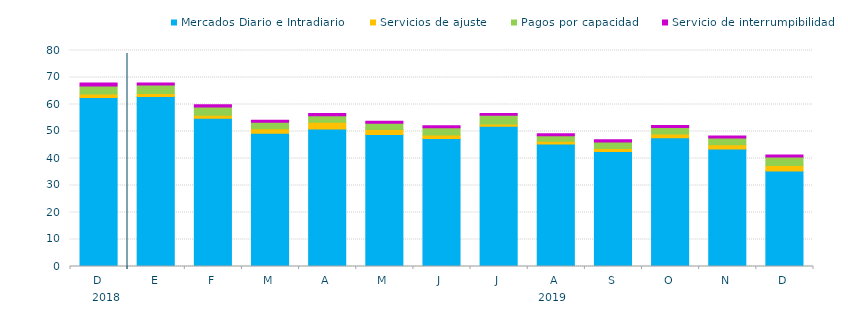
| Category | Mercados Diario e Intradiario  | Servicios de ajuste | Pagos por capacidad | Servicio de interrumpibilidad |
|---|---|---|---|---|
| D | 62.58 | 1.28 | 3.03 | 1.08 |
| E | 62.95 | 1.15 | 3.16 | 0.71 |
| F | 54.9 | 1.14 | 3.08 | 0.75 |
| M | 49.33 | 1.73 | 2.38 | 0.72 |
| A | 50.89 | 2.56 | 2.41 | 0.77 |
| M | 48.92 | 1.8 | 2.29 | 0.76 |
| J | 47.39 | 1.31 | 2.69 | 0.75 |
| J | 51.96 | 0.81 | 3.25 | 0.69 |
| A | 45.37 | 1.02 | 2.07 | 0.74 |
| S | 42.58 | 1.09 | 2.43 | 0.8 |
| O | 47.72 | 1.38 | 2.37 | 0.79 |
| N | 43.56 | 1.51 | 2.49 | 0.76 |
| D | 35.34 | 2.07 | 3.11 | 0.76 |